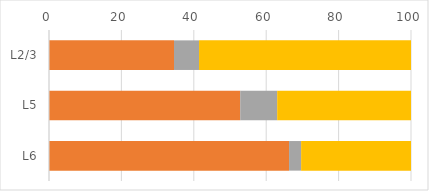
| Category | Series 0 | Series 1 | Series 2 | Series 3 |
|---|---|---|---|---|
| L2/3 | 0 | 34.537 | 6.909 | 58.554 |
| L5 | 0 | 52.824 | 10.208 | 36.968 |
| L6 | 0 | 66.314 | 3.331 | 30.356 |